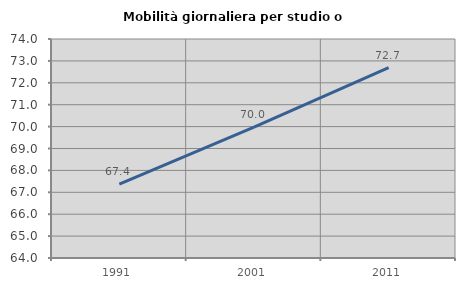
| Category | Mobilità giornaliera per studio o lavoro |
|---|---|
| 1991.0 | 67.373 |
| 2001.0 | 69.976 |
| 2011.0 | 72.695 |